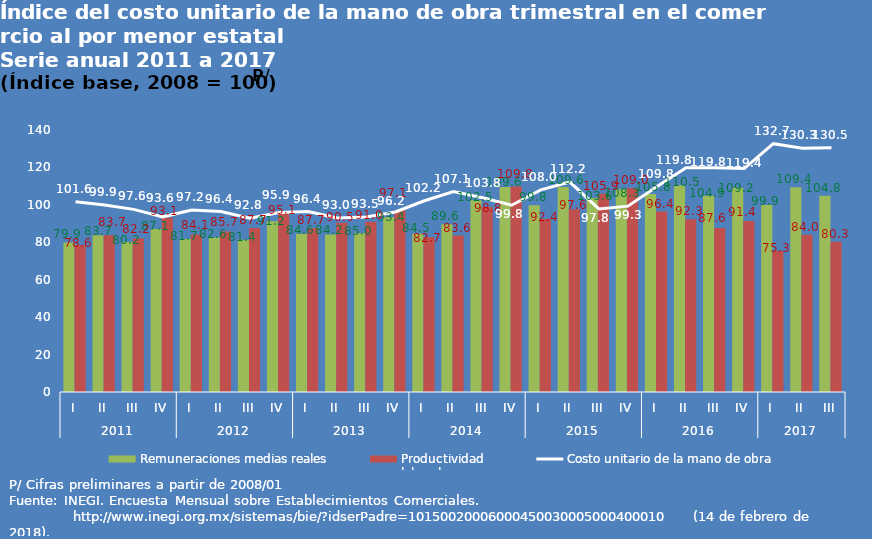
| Category | Remuneraciones medias reales | Productividad 
laboral |
|---|---|---|
| 0 | 79.9 | 78.6 |
| 1 | 83.7 | 83.7 |
| 2 | 80.2 | 82.2 |
| 3 | 87.1 | 93.1 |
| 4 | 81.7 | 84.1 |
| 5 | 82.6 | 85.7 |
| 6 | 81.4 | 87.7 |
| 7 | 91.2 | 95.1 |
| 8 | 84.6 | 87.7 |
| 9 | 84.2 | 90.5 |
| 10 | 85 | 91 |
| 11 | 93.4 | 97.1 |
| 12 | 84.5 | 82.7 |
| 13 | 89.6 | 83.6 |
| 14 | 102.5 | 98.8 |
| 15 | 109.6 | 109.8 |
| 16 | 99.8 | 92.4 |
| 17 | 109.6 | 97.6 |
| 18 | 103.6 | 105.9 |
| 19 | 108.3 | 109 |
| 20 | 105.8 | 96.4 |
| 21 | 110.5 | 92.3 |
| 22 | 104.9 | 87.6 |
| 23 | 109.2 | 91.4 |
| 24 | 99.9 | 75.3 |
| 25 | 109.4 | 84 |
| 26 | 104.8 | 80.3 |